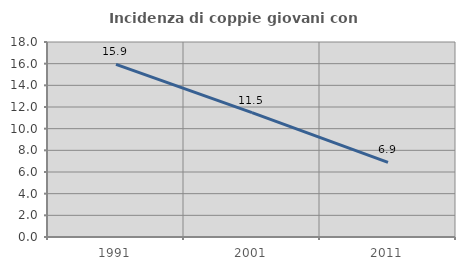
| Category | Incidenza di coppie giovani con figli |
|---|---|
| 1991.0 | 15.933 |
| 2001.0 | 11.484 |
| 2011.0 | 6.882 |